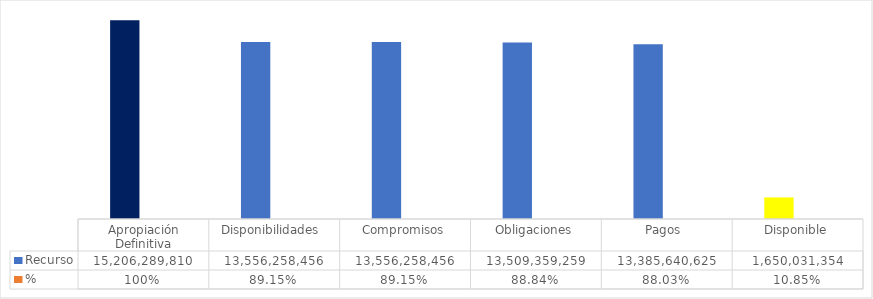
| Category | Recurso  | % |
|---|---|---|
| Apropiación Definitiva | 15206289810.39 | 1 |
| Disponibilidades  | 13556258455.97 | 0.891 |
| Compromisos | 13556258455.97 | 0.891 |
| Obligaciones | 13509359258.97 | 0.888 |
| Pagos  | 13385640624.81 | 0.88 |
| Disponible | 1650031354.42 | 0.109 |